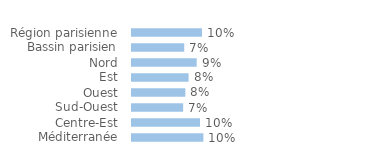
| Category | Series 0 |
|---|---|
| Région parisienne | 0.099 |
| Bassin parisien | 0.074 |
| Nord | 0.092 |
| Est | 0.08 |
| Ouest | 0.076 |
| Sud-Ouest | 0.072 |
| Centre-Est | 0.096 |
| Méditerranée | 0.101 |